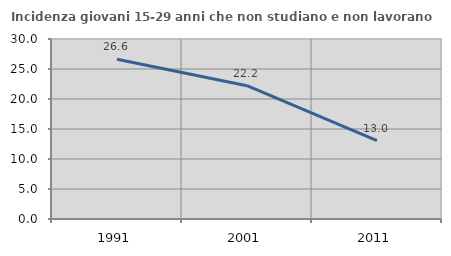
| Category | Incidenza giovani 15-29 anni che non studiano e non lavorano  |
|---|---|
| 1991.0 | 26.638 |
| 2001.0 | 22.222 |
| 2011.0 | 13.043 |